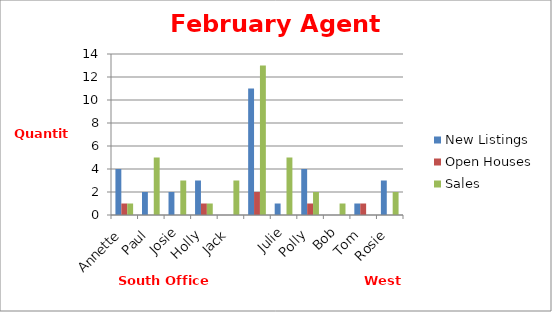
| Category | New Listings | Open Houses | Sales |
|---|---|---|---|
| Annette | 4 | 1 | 1 |
| Paul | 2 | 0 | 5 |
| Josie | 2 | 0 | 3 |
| Holly | 3 | 1 | 1 |
| Jack | 0 | 0 | 3 |
|  | 11 | 2 | 13 |
| Julie | 1 | 0 | 5 |
| Polly | 4 | 1 | 2 |
| Bob | 0 | 0 | 1 |
| Tom | 1 | 1 | 0 |
| Rosie | 3 | 0 | 2 |